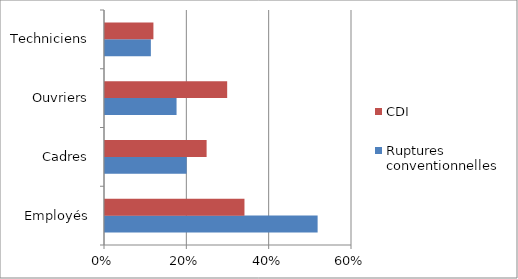
| Category | Ruptures conventionnelles | CDI |
|---|---|---|
| Employés | 0.516 | 0.339 |
| Cadres | 0.198 | 0.247 |
| Ouvriers | 0.174 | 0.297 |
| Techniciens | 0.111 | 0.118 |